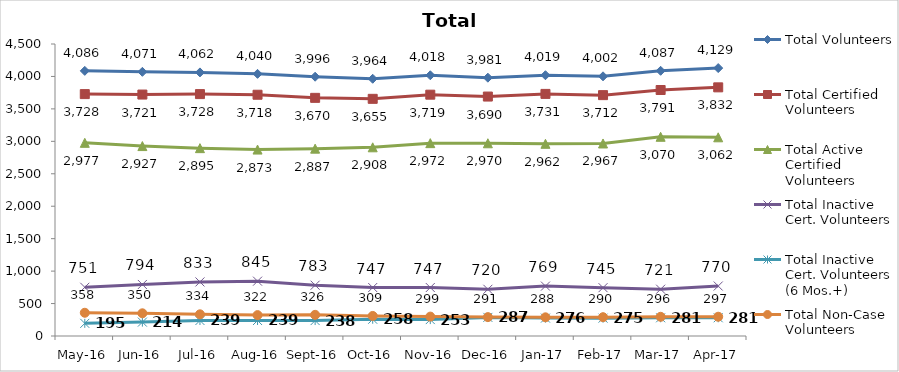
| Category | Total Volunteers | Total Certified Volunteers | Total Active Certified Volunteers | Total Inactive Cert. Volunteers | Total Inactive Cert. Volunteers (6 Mos.+) | Total Non-Case Volunteers |
|---|---|---|---|---|---|---|
| May-16 | 4086 | 3728 | 2977 | 751 | 195 | 358 |
| Jun-16 | 4071 | 3721 | 2927 | 794 | 214 | 350 |
| Jul-16 | 4062 | 3728 | 2895 | 833 | 239 | 334 |
| Aug-16 | 4040 | 3718 | 2873 | 845 | 239 | 322 |
| Sep-16 | 3996 | 3670 | 2887 | 783 | 238 | 326 |
| Oct-16 | 3964 | 3655 | 2908 | 747 | 258 | 309 |
| Nov-16 | 4018 | 3719 | 2972 | 747 | 253 | 299 |
| Dec-16 | 3981 | 3690 | 2970 | 720 | 287 | 291 |
| Jan-17 | 4019 | 3731 | 2962 | 769 | 276 | 288 |
| Feb-17 | 4002 | 3712 | 2967 | 745 | 275 | 290 |
| Mar-17 | 4087 | 3791 | 3070 | 721 | 281 | 296 |
| Apr-17 | 4129 | 3832 | 3062 | 770 | 281 | 297 |